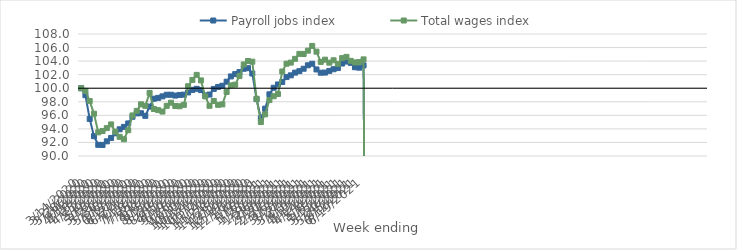
| Category | Payroll jobs index | Total wages index |
|---|---|---|
| 14/03/2020 | 100 | 100 |
| 21/03/2020 | 98.971 | 99.604 |
| 28/03/2020 | 95.467 | 98.106 |
| 04/04/2020 | 92.922 | 96.239 |
| 11/04/2020 | 91.648 | 93.488 |
| 18/04/2020 | 91.632 | 93.693 |
| 25/04/2020 | 92.163 | 94.114 |
| 02/05/2020 | 92.661 | 94.661 |
| 09/05/2020 | 93.345 | 93.586 |
| 16/05/2020 | 93.938 | 92.82 |
| 23/05/2020 | 94.296 | 92.472 |
| 30/05/2020 | 94.804 | 93.802 |
| 06/06/2020 | 95.79 | 95.983 |
| 13/06/2020 | 96.291 | 96.659 |
| 20/06/2020 | 96.307 | 97.626 |
| 27/06/2020 | 95.924 | 97.398 |
| 04/07/2020 | 97.286 | 99.305 |
| 11/07/2020 | 98.453 | 96.936 |
| 18/07/2020 | 98.574 | 96.771 |
| 25/07/2020 | 98.8 | 96.557 |
| 01/08/2020 | 99.036 | 97.398 |
| 08/08/2020 | 99.039 | 97.865 |
| 15/08/2020 | 98.915 | 97.373 |
| 22/08/2020 | 99.01 | 97.336 |
| 29/08/2020 | 99.05 | 97.544 |
| 05/09/2020 | 99.381 | 100.291 |
| 12/09/2020 | 99.754 | 101.228 |
| 19/09/2020 | 99.918 | 101.971 |
| 26/09/2020 | 99.725 | 101.154 |
| 03/10/2020 | 98.937 | 98.795 |
| 10/10/2020 | 99.064 | 97.403 |
| 17/10/2020 | 99.896 | 98.12 |
| 24/10/2020 | 100.185 | 97.546 |
| 31/10/2020 | 100.363 | 97.615 |
| 07/11/2020 | 100.966 | 99.446 |
| 14/11/2020 | 101.741 | 100.424 |
| 21/11/2020 | 102.085 | 100.522 |
| 28/11/2020 | 102.383 | 101.813 |
| 05/12/2020 | 102.872 | 103.509 |
| 12/12/2020 | 102.957 | 104.014 |
| 19/12/2020 | 102.168 | 103.915 |
| 26/12/2020 | 98.391 | 98.452 |
| 02/01/2021 | 95.58 | 95.006 |
| 09/01/2021 | 96.988 | 96.148 |
| 16/01/2021 | 99.101 | 98.251 |
| 23/01/2021 | 100.068 | 98.817 |
| 30/01/2021 | 100.556 | 99.148 |
| 06/02/2021 | 100.923 | 102.467 |
| 13/02/2021 | 101.643 | 103.619 |
| 20/02/2021 | 101.902 | 103.78 |
| 27/02/2021 | 102.3 | 104.333 |
| 06/03/2021 | 102.521 | 105.064 |
| 13/03/2021 | 102.877 | 105.052 |
| 20/03/2021 | 103.384 | 105.539 |
| 27/03/2021 | 103.612 | 106.245 |
| 03/04/2021 | 102.769 | 105.395 |
| 10/04/2021 | 102.293 | 103.884 |
| 17/04/2021 | 102.308 | 104.211 |
| 24/04/2021 | 102.558 | 103.772 |
| 01/05/2021 | 102.806 | 104.122 |
| 08/05/2021 | 102.974 | 103.594 |
| 15/05/2021 | 103.642 | 104.439 |
| 22/05/2021 | 103.934 | 104.625 |
| 29/05/2021 | 103.744 | 104.038 |
| 05/06/2021 | 103.091 | 103.805 |
| 12/06/2021 | 103.033 | 103.851 |
| 19/06/2021 | 103.366 | 104.254 |